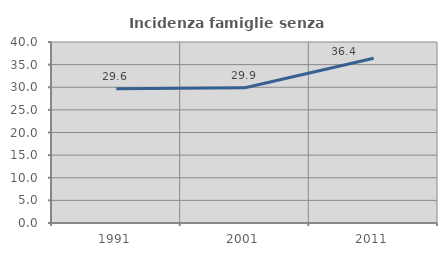
| Category | Incidenza famiglie senza nuclei |
|---|---|
| 1991.0 | 29.646 |
| 2001.0 | 29.893 |
| 2011.0 | 36.418 |